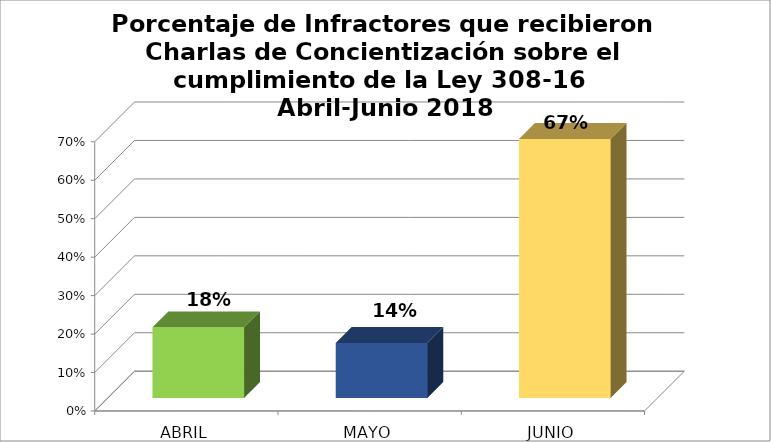
| Category | Series 0 |
|---|---|
| ABRIL | 0.184 |
| MAYO | 0.143 |
| JUNIO | 0.673 |